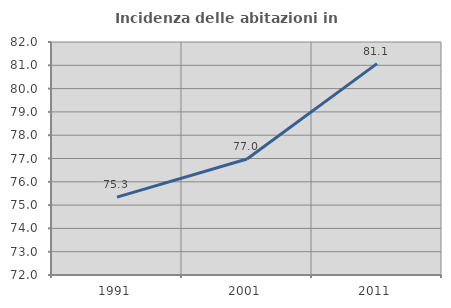
| Category | Incidenza delle abitazioni in proprietà  |
|---|---|
| 1991.0 | 75.342 |
| 2001.0 | 76.976 |
| 2011.0 | 81.071 |